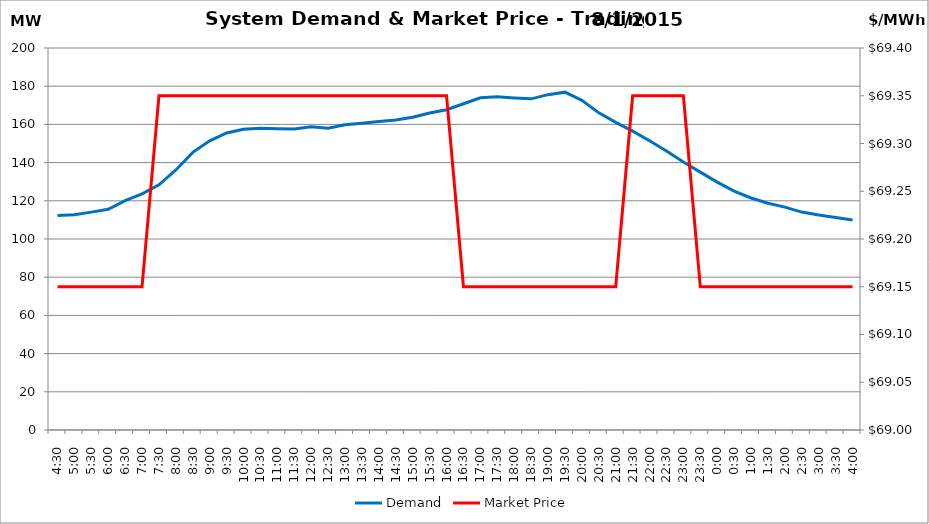
| Category | Demand |
|---|---|
| 0.1875 | 112.34 |
| 0.20833333333333334 | 112.72 |
| 0.22916666666666666 | 114.07 |
| 0.25 | 115.59 |
| 0.270833333333333 | 120.12 |
| 0.291666666666667 | 123.6 |
| 0.3125 | 128.36 |
| 0.333333333333333 | 136.14 |
| 0.354166666666667 | 145.36 |
| 0.375 | 151.43 |
| 0.395833333333333 | 155.52 |
| 0.416666666666667 | 157.48 |
| 0.4375 | 157.92 |
| 0.458333333333333 | 157.67 |
| 0.479166666666667 | 157.56 |
| 0.5 | 158.73 |
| 0.520833333333333 | 157.95 |
| 0.541666666666667 | 159.78 |
| 0.5625 | 160.65 |
| 0.583333333333333 | 161.51 |
| 0.604166666666667 | 162.3 |
| 0.625 | 163.78 |
| 0.645833333333334 | 165.99 |
| 0.666666666666667 | 167.66 |
| 0.6875 | 170.83 |
| 0.708333333333334 | 173.94 |
| 0.729166666666667 | 174.49 |
| 0.75 | 173.84 |
| 0.770833333333334 | 173.38 |
| 0.791666666666667 | 175.57 |
| 0.8125 | 176.88 |
| 0.833333333333334 | 172.6 |
| 0.854166666666667 | 166.05 |
| 0.875 | 161.07 |
| 0.895833333333334 | 156.49 |
| 0.916666666666667 | 151.43 |
| 0.9375 | 146.06 |
| 0.958333333333334 | 140.29 |
| 0.979166666666667 | 135.02 |
| 1900-01-01 | 129.78 |
| 1900-01-01 00:30:00 | 125.06 |
| 1900-01-01 01:00:00 | 121.46 |
| 1900-01-01 01:30:00 | 118.75 |
| 1900-01-01 02:00:00 | 116.68 |
| 1900-01-01 02:30:00 | 114.1 |
| 1900-01-01 03:00:00 | 112.62 |
| 1900-01-01 03:30:00 | 111.25 |
| 1900-01-01 04:00:00 | 109.91 |